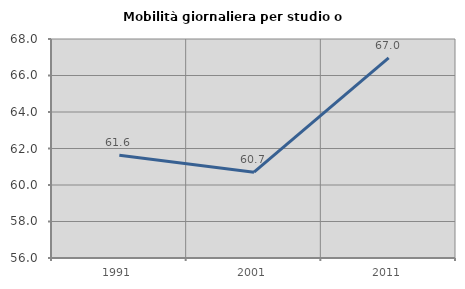
| Category | Mobilità giornaliera per studio o lavoro |
|---|---|
| 1991.0 | 61.63 |
| 2001.0 | 60.703 |
| 2011.0 | 66.967 |